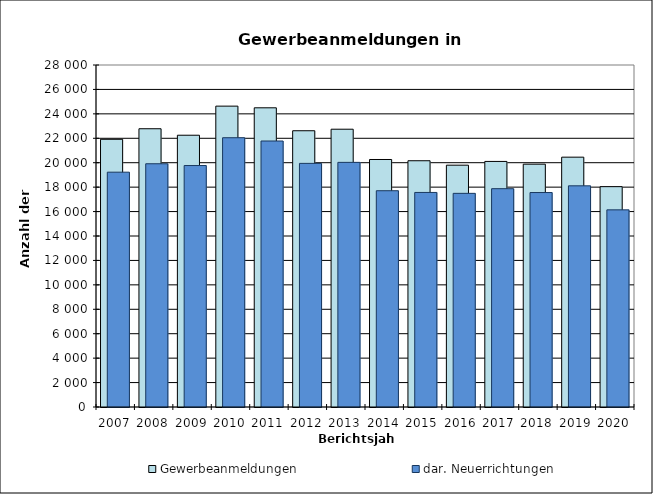
| Category | Gewerbeanmeldungen | dar. Neuerrichtungen |
|---|---|---|
| 2007.0 | 21918 | 19225 |
| 2008.0 | 22781 | 19914 |
| 2009.0 | 22250 | 19769 |
| 2010.0 | 24632 | 22046 |
| 2011.0 | 24495 | 21777 |
| 2012.0 | 22618 | 19945 |
| 2013.0 | 22743 | 20029 |
| 2014.0 | 20264 | 17706 |
| 2015.0 | 20162 | 17566 |
| 2016.0 | 19798 | 17492 |
| 2017.0 | 20105 | 17874 |
| 2018.0 | 19880 | 17558 |
| 2019.0 | 20454 | 18108 |
| 2020.0 | 18040 | 16141 |